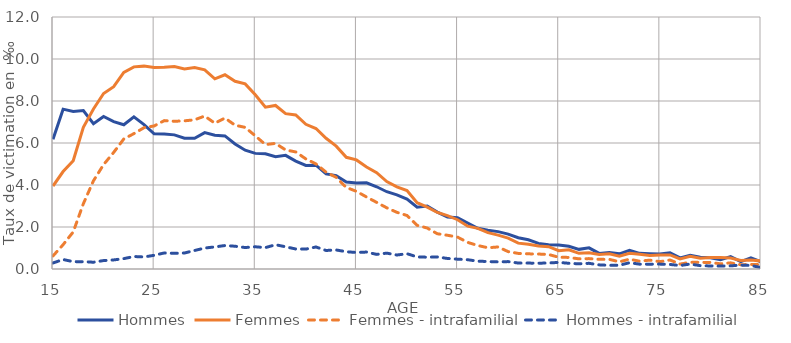
| Category | Hommes | Femmes | Femmes - intrafamilial | Hommes - intrafamilial |
|---|---|---|---|---|
| 15.0 | 6.179 | 3.95 | 0.623 | 0.288 |
| 16.0 | 7.612 | 4.64 | 1.158 | 0.452 |
| 17.0 | 7.505 | 5.153 | 1.766 | 0.349 |
| 18.0 | 7.545 | 6.744 | 3.107 | 0.347 |
| 19.0 | 6.92 | 7.617 | 4.2 | 0.323 |
| 20.0 | 7.261 | 8.359 | 4.97 | 0.401 |
| 21.0 | 7.016 | 8.684 | 5.553 | 0.432 |
| 22.0 | 6.868 | 9.36 | 6.195 | 0.494 |
| 23.0 | 7.244 | 9.625 | 6.446 | 0.595 |
| 24.0 | 6.879 | 9.66 | 6.73 | 0.573 |
| 25.0 | 6.436 | 9.6 | 6.811 | 0.654 |
| 26.0 | 6.429 | 9.606 | 7.066 | 0.764 |
| 27.0 | 6.387 | 9.646 | 7.034 | 0.746 |
| 28.0 | 6.229 | 9.528 | 7.056 | 0.762 |
| 29.0 | 6.225 | 9.592 | 7.106 | 0.881 |
| 30.0 | 6.496 | 9.484 | 7.283 | 0.998 |
| 31.0 | 6.372 | 9.057 | 6.942 | 1.052 |
| 32.0 | 6.338 | 9.25 | 7.189 | 1.117 |
| 33.0 | 5.957 | 8.938 | 6.846 | 1.084 |
| 34.0 | 5.657 | 8.816 | 6.744 | 1.022 |
| 35.0 | 5.506 | 8.299 | 6.342 | 1.058 |
| 36.0 | 5.488 | 7.706 | 5.925 | 1.018 |
| 37.0 | 5.344 | 7.787 | 5.982 | 1.156 |
| 38.0 | 5.411 | 7.398 | 5.669 | 1.058 |
| 39.0 | 5.134 | 7.337 | 5.574 | 0.953 |
| 40.0 | 4.931 | 6.889 | 5.242 | 0.948 |
| 41.0 | 4.944 | 6.69 | 5.004 | 1.048 |
| 42.0 | 4.529 | 6.224 | 4.61 | 0.882 |
| 43.0 | 4.447 | 5.85 | 4.364 | 0.907 |
| 44.0 | 4.141 | 5.318 | 3.884 | 0.822 |
| 45.0 | 4.095 | 5.195 | 3.698 | 0.786 |
| 46.0 | 4.108 | 4.857 | 3.429 | 0.807 |
| 47.0 | 3.916 | 4.584 | 3.172 | 0.696 |
| 48.0 | 3.68 | 4.161 | 2.914 | 0.756 |
| 49.0 | 3.527 | 3.91 | 2.7 | 0.666 |
| 50.0 | 3.326 | 3.732 | 2.548 | 0.729 |
| 51.0 | 2.944 | 3.158 | 2.081 | 0.573 |
| 52.0 | 2.995 | 2.945 | 1.951 | 0.563 |
| 53.0 | 2.712 | 2.692 | 1.678 | 0.576 |
| 54.0 | 2.478 | 2.543 | 1.607 | 0.501 |
| 55.0 | 2.446 | 2.347 | 1.517 | 0.468 |
| 56.0 | 2.19 | 2.039 | 1.267 | 0.442 |
| 57.0 | 1.938 | 1.934 | 1.118 | 0.372 |
| 58.0 | 1.846 | 1.731 | 1.012 | 0.355 |
| 59.0 | 1.78 | 1.612 | 1.05 | 0.339 |
| 60.0 | 1.663 | 1.47 | 0.828 | 0.352 |
| 61.0 | 1.49 | 1.231 | 0.742 | 0.284 |
| 62.0 | 1.393 | 1.181 | 0.722 | 0.281 |
| 63.0 | 1.22 | 1.1 | 0.712 | 0.274 |
| 64.0 | 1.159 | 1.062 | 0.692 | 0.288 |
| 65.0 | 1.147 | 0.87 | 0.56 | 0.314 |
| 66.0 | 1.083 | 0.916 | 0.552 | 0.272 |
| 67.0 | 0.936 | 0.748 | 0.483 | 0.247 |
| 68.0 | 1.008 | 0.772 | 0.495 | 0.27 |
| 69.0 | 0.744 | 0.692 | 0.459 | 0.197 |
| 70.0 | 0.791 | 0.727 | 0.46 | 0.174 |
| 71.0 | 0.723 | 0.605 | 0.341 | 0.18 |
| 72.0 | 0.886 | 0.748 | 0.468 | 0.299 |
| 73.0 | 0.744 | 0.697 | 0.37 | 0.23 |
| 74.0 | 0.726 | 0.646 | 0.422 | 0.23 |
| 75.0 | 0.717 | 0.667 | 0.35 | 0.232 |
| 76.0 | 0.767 | 0.669 | 0.428 | 0.217 |
| 77.0 | 0.528 | 0.48 | 0.236 | 0.165 |
| 78.0 | 0.652 | 0.603 | 0.318 | 0.237 |
| 79.0 | 0.562 | 0.516 | 0.316 | 0.159 |
| 80.0 | 0.531 | 0.543 | 0.315 | 0.145 |
| 81.0 | 0.44 | 0.547 | 0.247 | 0.138 |
| 82.0 | 0.588 | 0.521 | 0.293 | 0.15 |
| 83.0 | 0.351 | 0.41 | 0.203 | 0.186 |
| 84.0 | 0.53 | 0.429 | 0.217 | 0.169 |
| 85.0 | 0.339 | 0.382 | 0.214 | 0.068 |